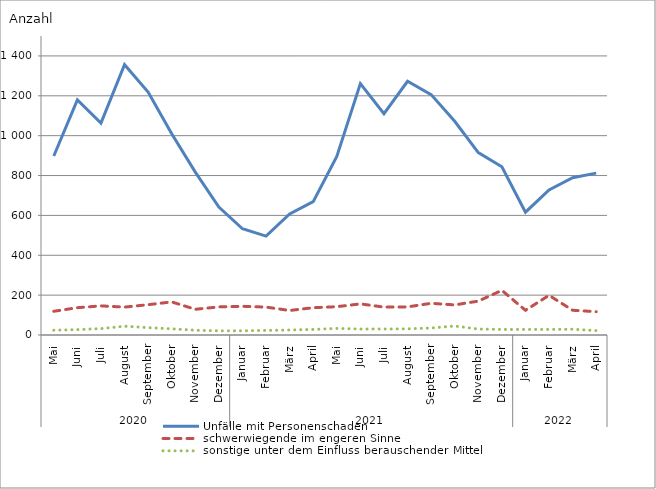
| Category | Unfälle mit Personenschaden | schwerwiegende im engeren Sinne | sonstige unter dem Einfluss berauschender Mittel |
|---|---|---|---|
| 0 | 898 | 119 | 24 |
| 1 | 1179 | 137 | 27 |
| 2 | 1063 | 146 | 32 |
| 3 | 1356 | 140 | 44 |
| 4 | 1219 | 152 | 37 |
| 5 | 1010 | 166 | 31 |
| 6 | 817 | 129 | 24 |
| 7 | 642 | 141 | 21 |
| 8 | 533 | 144 | 21 |
| 9 | 496 | 140 | 23 |
| 10 | 607 | 123 | 25 |
| 11 | 669 | 137 | 28 |
| 12 | 896 | 142 | 33 |
| 13 | 1261 | 156 | 30 |
| 14 | 1110 | 140 | 30 |
| 15 | 1273 | 141 | 31 |
| 16 | 1206 | 159 | 35 |
| 17 | 1072 | 151 | 45 |
| 18 | 915 | 170 | 30 |
| 19 | 844 | 224 | 28 |
| 20 | 616 | 124 | 28 |
| 21 | 728 | 199 | 28 |
| 22 | 789 | 124 | 29 |
| 23 | 812 | 117 | 22 |